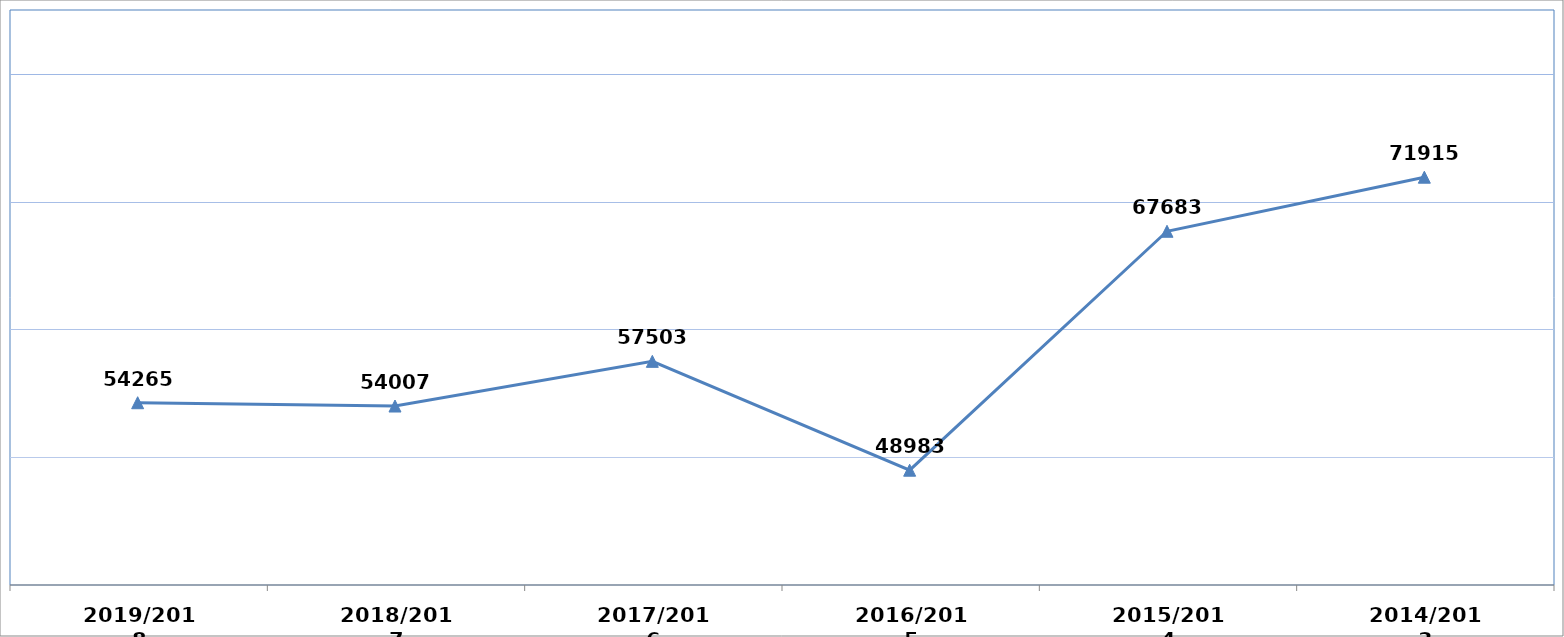
| Category |  عدد المسجلين الجـُدد |
|---|---|
| 2014/2013 | 71915 |
| 2015/2014 | 67683 |
| 2016/2015 | 48983 |
| 2017/2016 | 57503 |
| 2018/2017 | 54007 |
| 2019/2018 | 54265 |